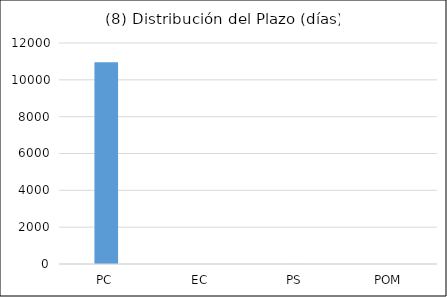
| Category | PC |
|---|---|
| PC | 10958 |
| EC | 0 |
| PS | 2 |
| POM | 0 |